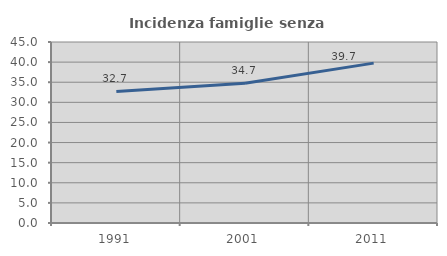
| Category | Incidenza famiglie senza nuclei |
|---|---|
| 1991.0 | 32.71 |
| 2001.0 | 34.741 |
| 2011.0 | 39.744 |